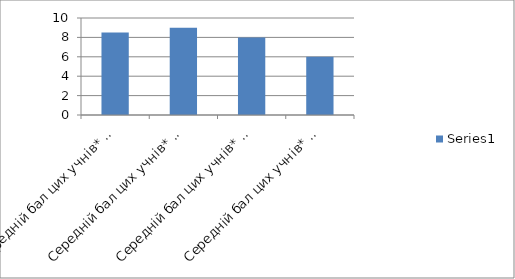
| Category | Series 0 |
|---|---|
| Середній бал цих учнів* за результатами ДПА у 9-му класі | 8.5 |
| Середній бал цих учнів* за результатами річного оцінювання у 10-му класі | 9 |
| Середній бал цих учнів* за результатами  річного оцінювання у 11-му класі | 8 |
| Середній бал цих учнів* за результатами ДПА у 11-му класі | 6 |